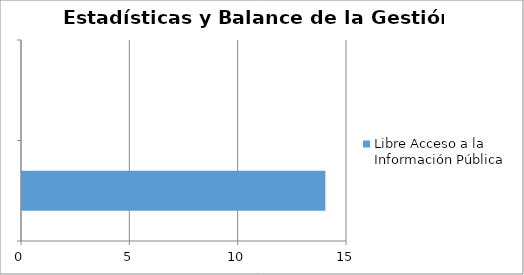
| Category | Libre Acceso a la Información Pública |
|---|---|
|  | 14 |
|  | 0 |